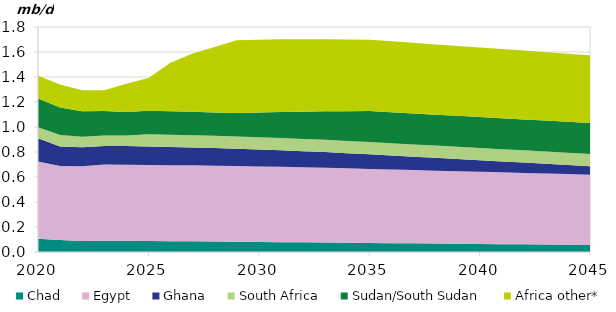
| Category | Chad | Egypt | Ghana | South Africa | Sudan/South Sudan | Africa other* |
|---|---|---|---|---|---|---|
| 2020-01-01 | 0.106 | 0.619 | 0.185 | 0.088 | 0.23 | 0.183 |
| 2021-01-01 | 0.096 | 0.592 | 0.157 | 0.091 | 0.221 | 0.184 |
| 2022-01-01 | 0.087 | 0.6 | 0.152 | 0.083 | 0.205 | 0.167 |
| 2023-01-01 | 0.089 | 0.61 | 0.149 | 0.083 | 0.196 | 0.167 |
| 2024-01-01 | 0.09 | 0.608 | 0.151 | 0.083 | 0.188 | 0.228 |
| 2025-01-01 | 0.088 | 0.608 | 0.148 | 0.098 | 0.188 | 0.261 |
| 2026-01-01 | 0.087 | 0.608 | 0.146 | 0.098 | 0.188 | 0.388 |
| 2027-01-01 | 0.085 | 0.608 | 0.143 | 0.098 | 0.188 | 0.466 |
| 2028-01-01 | 0.084 | 0.607 | 0.141 | 0.098 | 0.188 | 0.524 |
| 2029-01-01 | 0.082 | 0.606 | 0.138 | 0.098 | 0.188 | 0.582 |
| 2030-01-01 | 0.08 | 0.604 | 0.136 | 0.098 | 0.198 | 0.582 |
| 2031-01-01 | 0.079 | 0.602 | 0.133 | 0.098 | 0.208 | 0.583 |
| 2032-01-01 | 0.077 | 0.6 | 0.13 | 0.098 | 0.218 | 0.58 |
| 2033-01-01 | 0.076 | 0.598 | 0.126 | 0.098 | 0.228 | 0.577 |
| 2034-01-01 | 0.074 | 0.595 | 0.122 | 0.098 | 0.238 | 0.574 |
| 2035-01-01 | 0.072 | 0.592 | 0.117 | 0.098 | 0.248 | 0.571 |
| 2036-01-01 | 0.071 | 0.589 | 0.112 | 0.098 | 0.248 | 0.568 |
| 2037-01-01 | 0.069 | 0.586 | 0.107 | 0.098 | 0.248 | 0.565 |
| 2038-01-01 | 0.068 | 0.583 | 0.103 | 0.098 | 0.248 | 0.562 |
| 2039-01-01 | 0.066 | 0.58 | 0.098 | 0.098 | 0.248 | 0.559 |
| 2040-01-01 | 0.064 | 0.577 | 0.093 | 0.098 | 0.248 | 0.556 |
| 2041-01-01 | 0.063 | 0.574 | 0.088 | 0.098 | 0.248 | 0.553 |
| 2042-01-01 | 0.061 | 0.571 | 0.083 | 0.098 | 0.248 | 0.55 |
| 2043-01-01 | 0.06 | 0.568 | 0.078 | 0.098 | 0.248 | 0.547 |
| 2044-01-01 | 0.058 | 0.565 | 0.073 | 0.098 | 0.248 | 0.544 |
| 2045-01-01 | 0.056 | 0.562 | 0.068 | 0.098 | 0.248 | 0.541 |